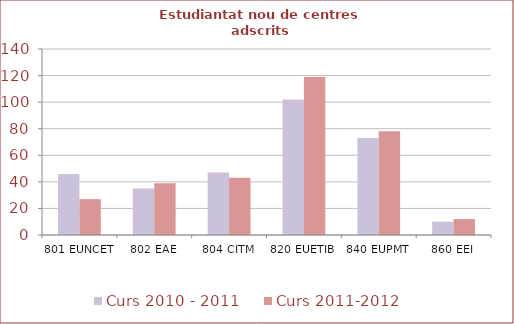
| Category | Curs 2010 - 2011 | Curs 2011-2012 |
|---|---|---|
| 801 EUNCET | 46 | 27 |
| 802 EAE | 35 | 39 |
| 804 CITM | 47 | 43 |
| 820 EUETIB | 102 | 119 |
| 840 EUPMT | 73 | 78 |
| 860 EEI | 10 | 12 |